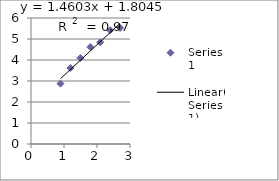
| Category | Series 0 |
|---|---|
| 0.8927900303521317 | 2.875 |
| 1.193820026016113 | 3.615 |
| 1.494850021680094 | 4.092 |
| 1.7958800173440752 | 4.619 |
| 2.0969100130080562 | 4.845 |
| 2.3979400086720375 | 5.416 |
| 2.6989700043360187 | 5.526 |